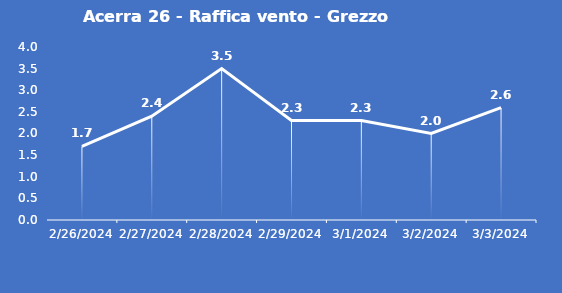
| Category | Acerra 26 - Raffica vento - Grezzo (m/s) |
|---|---|
| 2/26/24 | 1.7 |
| 2/27/24 | 2.4 |
| 2/28/24 | 3.5 |
| 2/29/24 | 2.3 |
| 3/1/24 | 2.3 |
| 3/2/24 | 2 |
| 3/3/24 | 2.6 |